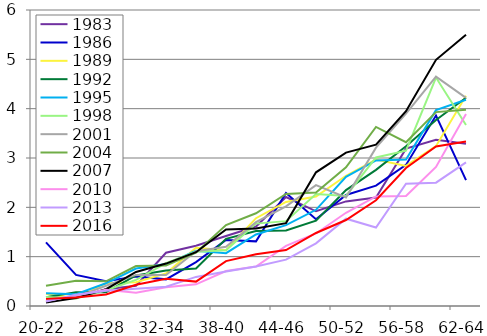
| Category | 1983 | 1986 | 1989 | 1992 | 1995 | 1998 | 2001 | 2004 | 2007 | 2010 | 2013 | 2016 |
|---|---|---|---|---|---|---|---|---|---|---|---|---|
| 20-22 | 0.18 | 1.29 | 0.25 | 0.18 | 0.26 | 0.18 | 0.13 | 0.41 | 0.07 | 0.1 | 0.09 | 0.144 |
| 23-25 | 0.16 | 0.63 | 0.16 | 0.28 | 0.24 | 0.15 | 0.18 | 0.51 | 0.16 | 0.22 | 0.23 | 0.17 |
| 26-28 | 0.34 | 0.5 | 0.46 | 0.28 | 0.46 | 0.32 | 0.41 | 0.5 | 0.34 | 0.33 | 0.31 | 0.232 |
| 29-31 | 0.41 | 0.6 | 0.48 | 0.62 | 0.76 | 0.53 | 0.63 | 0.81 | 0.69 | 0.27 | 0.35 | 0.432 |
| 32-34 | 1.08 | 0.54 | 0.66 | 0.72 | 0.85 | 0.87 | 0.63 | 0.82 | 0.86 | 0.38 | 0.39 | 0.551 |
| 35-37 | 1.22 | 0.89 | 1.18 | 0.76 | 1.12 | 1.1 | 1.11 | 1.08 | 1.09 | 0.44 | 0.59 | 0.494 |
| 38-40 | 1.42 | 1.34 | 1.13 | 1.36 | 1.07 | 1.13 | 1.2 | 1.64 | 1.55 | 0.71 | 0.7 | 0.91 |
| 41-43 | 1.61 | 1.31 | 1.78 | 1.52 | 1.45 | 1.67 | 1.7 | 1.88 | 1.57 | 0.8 | 0.8 | 1.05 |
| 44-46 | 2.21 | 2.29 | 2.11 | 1.53 | 1.64 | 1.72 | 2.02 | 2.27 | 1.68 | 1.22 | 0.94 | 1.135 |
| 47-49 | 1.92 | 1.76 | 2.22 | 1.73 | 1.95 | 2.27 | 2.45 | 2.3 | 2.71 | 1.47 | 1.27 | 1.481 |
| 50-52 | 2.12 | 2.25 | 2.64 | 2.35 | 2.62 | 2.23 | 2.2 | 2.81 | 3.11 | 1.89 | 1.77 | 1.742 |
| 53-55 | 2.2 | 2.44 | 2.97 | 2.76 | 2.95 | 3.01 | 3.21 | 3.63 | 3.27 | 2.22 | 1.59 | 2.144 |
| 56-58 | 3.19 | 2.86 | 2.84 | 3.24 | 2.97 | 3.15 | 3.9 | 3.32 | 3.95 | 2.23 | 2.48 | 2.797 |
| 59-61 | 3.37 | 3.86 | 3.24 | 3.77 | 3.97 | 4.63 | 4.65 | 3.93 | 4.99 | 2.82 | 2.5 | 3.232 |
| 62-64 | 3.29 | 2.55 | 4.26 | 4.22 | 4.18 | 3.67 | 4.22 | 3.98 | 5.5 | 3.89 | 2.91 | 3.333 |